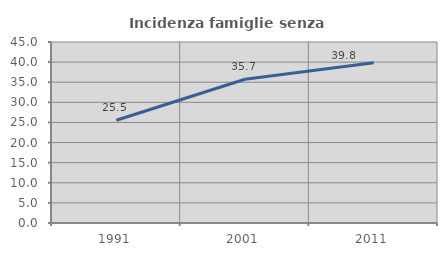
| Category | Incidenza famiglie senza nuclei |
|---|---|
| 1991.0 | 25.545 |
| 2001.0 | 35.736 |
| 2011.0 | 39.82 |